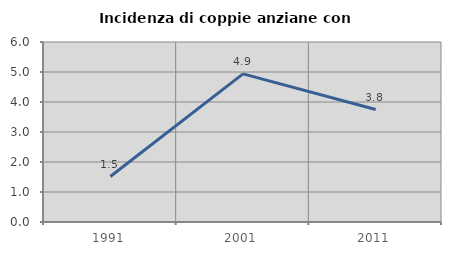
| Category | Incidenza di coppie anziane con figli |
|---|---|
| 1991.0 | 1.515 |
| 2001.0 | 4.938 |
| 2011.0 | 3.75 |